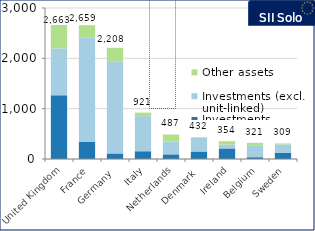
| Category | Investments (unit-linked) | Investments (excl. unit-linked) | Other assets |
|---|---|---|---|
| United Kingdom | 1266.604 | 932.464 | 463.929 |
| France | 339.683 | 2079.999 | 238.958 |
| Germany | 110.942 | 1831.547 | 265.506 |
| Italy | 154.291 | 696.767 | 70.35 |
| Netherlands | 91.846 | 255.976 | 139.095 |
| Denmark | 149.426 | 266.845 | 15.975 |
| Ireland | 209.916 | 77.185 | 67.128 |
| Belgium | 35.786 | 238.2 | 47.29 |
| Sweden | 126.067 | 163.549 | 19.153 |